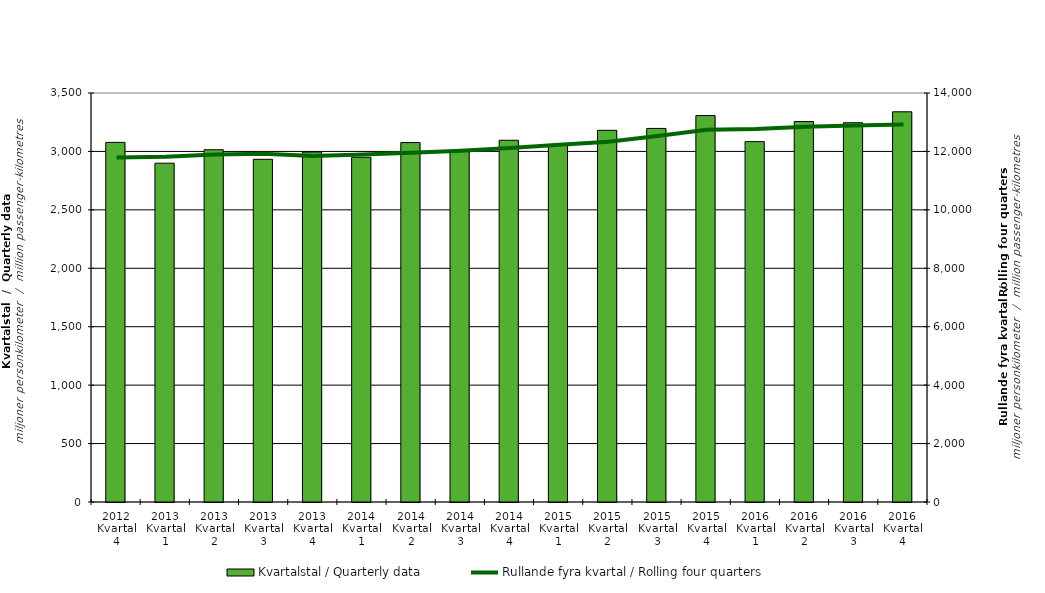
| Category | Kvartalstal / Quarterly data |
|---|---|
| 2012 Kvartal 4 | 3077.393 |
| 2013 Kvartal 1 | 2899.281 |
| 2013 Kvartal 2 | 3014.574 |
| 2013 Kvartal 3 | 2932.563 |
| 2013 Kvartal 4 | 2995.246 |
| 2014 Kvartal 1 | 2950.13 |
| 2014 Kvartal 2 | 3075.752 |
| 2014 Kvartal 3 | 2999.774 |
| 2014 Kvartal 4 | 3095.522 |
| 2015 Kvartal 1 | 3057.108 |
| 2015 Kvartal 2 | 3180.724 |
| 2015 Kvartal 3 | 3196.77 |
| 2015 Kvartal 4 | 3306.685 |
| 2016 Kvartal 1 | 3083.844 |
| 2016 Kvartal 2 | 3255.704 |
| 2016 Kvartal 3 | 3245.299 |
| 2016 Kvartal 4 | 3339.203 |